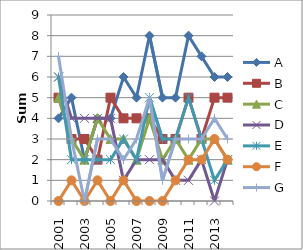
| Category | A | B | C | D | E | F | G |
|---|---|---|---|---|---|---|---|
| 2001.0 | 4 | 5 | 5 | 6 | 6 | 0 | 7 |
| 2002.0 | 5 | 3 | 3 | 4 | 2 | 1 | 3 |
| 2003.0 | 2 | 3 | 2 | 4 | 2 | 0 | 0 |
| 2004.0 | 4 | 2 | 4 | 4 | 2 | 1 | 3 |
| 2005.0 | 4 | 5 | 3 | 4 | 2 | 0 | 3 |
| 2006.0 | 6 | 4 | 3 | 1 | 3 | 1 | 2 |
| 2007.0 | 5 | 4 | 2 | 2 | 2 | 0 | 3 |
| 2008.0 | 8 | 4 | 4 | 2 | 5 | 0 | 5 |
| 2009.0 | 5 | 3 | 2 | 2 | 3 | 0 | 1 |
| 2010.0 | 5 | 3 | 3 | 1 | 3 | 1 | 3 |
| 2011.0 | 8 | 5 | 2 | 1 | 5 | 2 | 3 |
| 2012.0 | 7 | 3 | 3 | 2 | 3 | 2 | 3 |
| 2013.0 | 6 | 5 | 3 | 0 | 1 | 3 | 4 |
| 2014.0 | 6 | 5 | 2 | 2 | 2 | 2 | 3 |